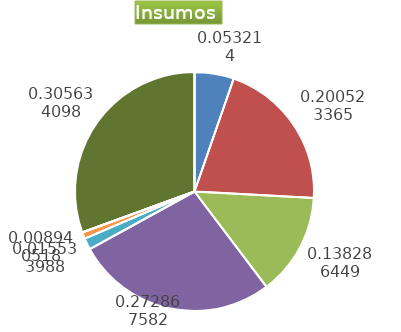
| Category | Series 0 |
|---|---|
| Control arvenses | 2257833.333 |
| Control fitosanitario | 8720214.667 |
| Cosecha y beneficio | 5867398.653 |
| Fertilización | 11577583.333 |
| Instalación | 659096.412 |
| Otros | 379340 |
| Podas | 0 |
| Riego | 0 |
| Transporte | 12967844 |
| Tutorado | 0 |